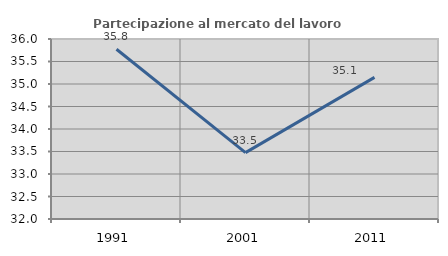
| Category | Partecipazione al mercato del lavoro  femminile |
|---|---|
| 1991.0 | 35.772 |
| 2001.0 | 33.475 |
| 2011.0 | 35.146 |